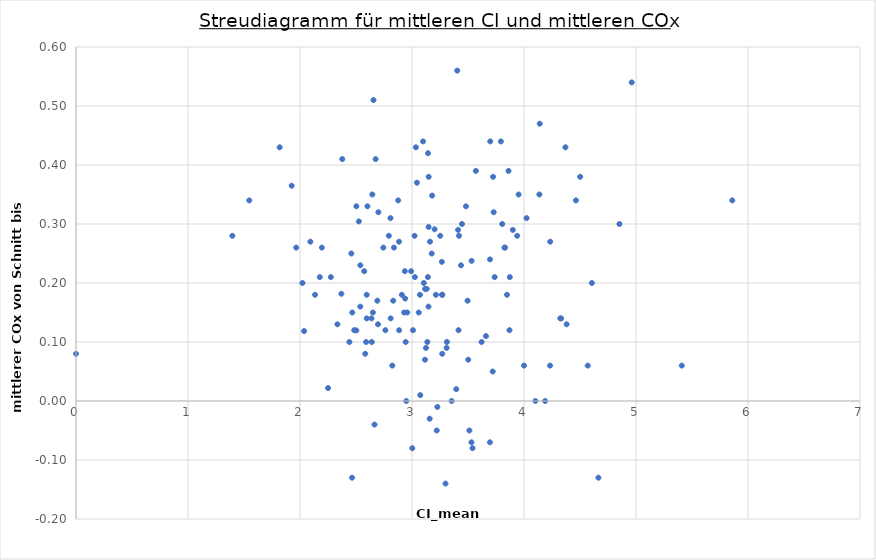
| Category | Series 0 |
|---|---|
| 0 | 0.022 |
| 1 | 0.348 |
| 2 | 0.295 |
| 3 | 0.238 |
| 4 | 0.182 |
| 5 | 0.174 |
| 6 | 0.12 |
| 7 | 0.236 |
| 8 | 0.304 |
| 9 | 0.291 |
| 10 | 0.119 |
| 11 | 0.365 |
| 12 | 0.18 |
| 13 | 0.26 |
| 14 | 0.29 |
| 15 | 0.35 |
| 16 | 0.18 |
| 17 | 0.14 |
| 18 | 0.44 |
| 19 | 0.27 |
| 20 | 0.13 |
| 21 | 0.21 |
| 22 | 0.38 |
| 23 | 0 |
| 24 | 0.18 |
| 25 | 0.29 |
| 26 | 0.15 |
| 27 | -0.08 |
| 28 | 0.1 |
| 29 | 0.07 |
| 30 | 0.09 |
| 31 | 0.08 |
| 32 | 0.17 |
| 33 | 0.17 |
| 34 | 0.23 |
| 35 | 0.2 |
| 36 | 0.21 |
| 37 | 0.18 |
| 38 | 0.28 |
| 39 | 0.21 |
| 40 | 0.1 |
| 41 | 0.09 |
| 42 | 0.05 |
| 43 | 0.14 |
| 44 | 0.3 |
| 45 | 0 |
| 46 | 0.25 |
| 47 | 0.15 |
| 48 | 0.12 |
| 49 | 0.41 |
| 50 | -0.05 |
| 51 | 0.12 |
| 52 | 0.13 |
| 53 | 0.08 |
| 54 | -0.14 |
| 55 | 0.21 |
| 56 | 0.12 |
| 57 | 0.43 |
| 58 | 0 |
| 59 | 0.31 |
| 60 | 0.12 |
| 61 | 0.1 |
| 62 | 0.06 |
| 63 | 0.19 |
| 64 | 0.32 |
| 65 | 0.2 |
| 66 | 0.1 |
| 67 | 0.33 |
| 68 | 0.06 |
| 69 | 0.23 |
| 70 | 0.41 |
| 71 | 0.24 |
| 72 | 0.28 |
| 73 | 0.44 |
| 74 | 0.18 |
| 75 | 0.14 |
| 76 | 0.1 |
| 77 | 0.26 |
| 78 | 0.42 |
| 79 | 0.47 |
| 80 | 0.18 |
| 81 | 0.26 |
| 82 | 0.28 |
| 83 | -0.08 |
| 84 | 0.32 |
| 85 | 0.51 |
| 86 | 0.14 |
| 87 | 0.13 |
| 88 | 0.28 |
| 89 | 0.26 |
| 90 | 0.1 |
| 91 | 0.15 |
| 92 | 0.22 |
| 93 | 0.22 |
| 94 | 0.18 |
| 95 | 0.06 |
| 96 | 0.15 |
| 97 | 0.43 |
| 98 | 0.3 |
| 99 | 0.33 |
| 100 | 0.16 |
| 101 | 0.1 |
| 102 | -0.01 |
| 103 | 0.37 |
| 104 | 0.34 |
| 105 | 0.11 |
| 106 | 0.2 |
| 107 | 0.38 |
| 108 | -0.13 |
| 109 | 0.07 |
| 110 | 0.27 |
| 111 | 0.27 |
| 112 | -0.04 |
| 113 | -0.13 |
| 114 | 0.35 |
| 115 | 0.34 |
| 116 | -0.05 |
| 117 | 0.15 |
| 118 | 0.18 |
| 119 | 0.01 |
| 120 | 0.26 |
| 121 | 0.14 |
| 122 | 0.26 |
| 123 | 0.21 |
| 124 | 0.17 |
| 125 | 0.12 |
| 126 | 0.27 |
| 127 | 0.06 |
| 128 | 0.31 |
| 129 | 0.3 |
| 130 | 0.25 |
| 131 | 0.12 |
| 132 | 0.02 |
| 133 | 0.44 |
| 134 | 0.34 |
| 135 | 0 |
| 136 | 0.06 |
| 137 | 0.22 |
| 138 | -0.03 |
| 139 | 0.19 |
| 140 | 0.33 |
| 141 | 0.28 |
| 142 | 0.34 |
| 143 | 0.08 |
| 144 | 0.39 |
| 145 | -0.07 |
| 146 | -0.07 |
| 147 | 0.35 |
| 148 | 0.21 |
| 149 | 0.54 |
| 150 | 0.56 |
| 151 | 0.16 |
| 152 | 0.43 |
| 153 | 0.38 |
| 154 | 0.28 |
| 155 | 0.39 |